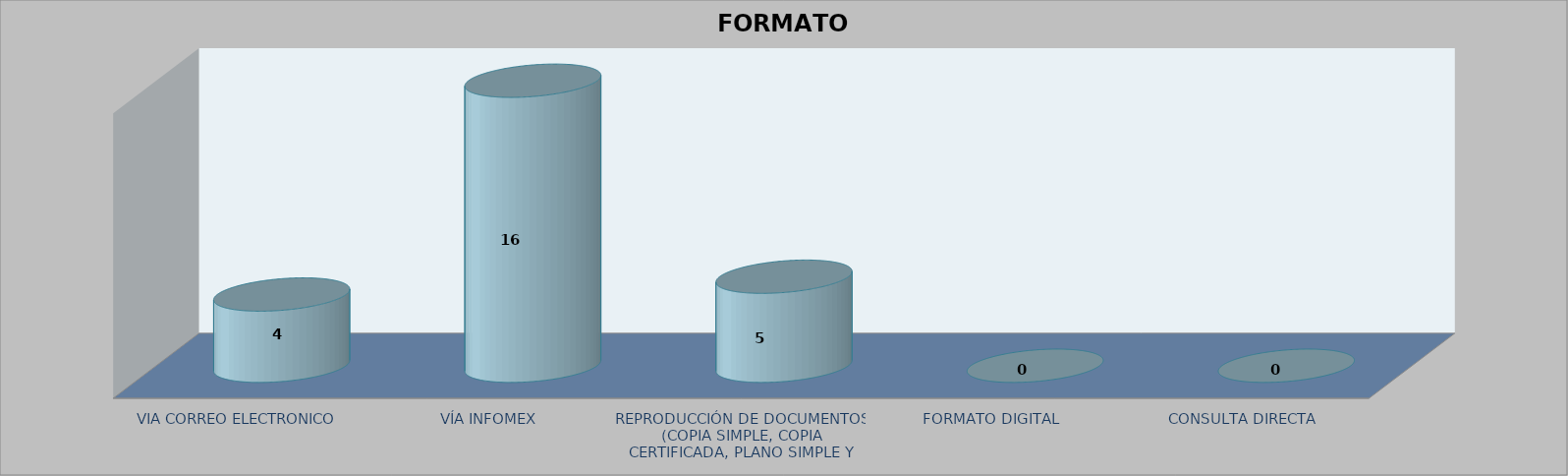
| Category |        FORMATO SOLICITADO | Series 1 | Series 2 |
|---|---|---|---|
| VIA CORREO ELECTRONICO |  |  | 4 |
| VÍA INFOMEX |  |  | 16 |
| REPRODUCCIÓN DE DOCUMENTOS (COPIA SIMPLE, COPIA CERTIFICADA, PLANO SIMPLE Y PLANO CERTIFICADO) |  |  | 5 |
| FORMATO DIGITAL |  |  | 0 |
| CONSULTA DIRECTA |  |  | 0 |